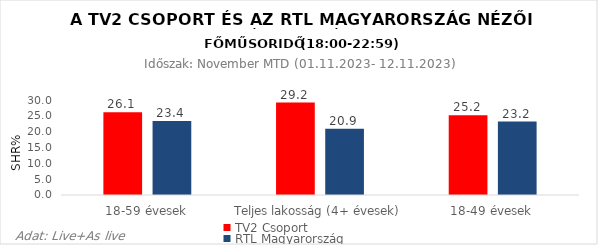
| Category | TV2 Csoport | RTL Magyarország |
|---|---|---|
| 18-59 évesek | 26.1 | 23.4 |
| Teljes lakosság (4+ évesek) | 29.2 | 20.9 |
| 18-49 évesek | 25.2 | 23.2 |